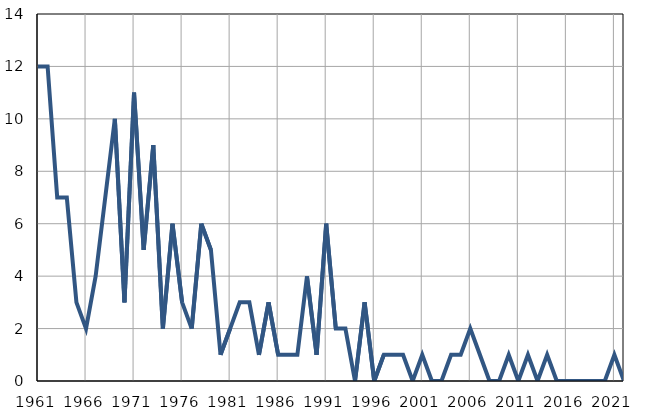
| Category | Infants
deaths |
|---|---|
| 1961.0 | 12 |
| 1962.0 | 12 |
| 1963.0 | 7 |
| 1964.0 | 7 |
| 1965.0 | 3 |
| 1966.0 | 2 |
| 1967.0 | 4 |
| 1968.0 | 7 |
| 1969.0 | 10 |
| 1970.0 | 3 |
| 1971.0 | 11 |
| 1972.0 | 5 |
| 1973.0 | 9 |
| 1974.0 | 2 |
| 1975.0 | 6 |
| 1976.0 | 3 |
| 1977.0 | 2 |
| 1978.0 | 6 |
| 1979.0 | 5 |
| 1980.0 | 1 |
| 1981.0 | 2 |
| 1982.0 | 3 |
| 1983.0 | 3 |
| 1984.0 | 1 |
| 1985.0 | 3 |
| 1986.0 | 1 |
| 1987.0 | 1 |
| 1988.0 | 1 |
| 1989.0 | 4 |
| 1990.0 | 1 |
| 1991.0 | 6 |
| 1992.0 | 2 |
| 1993.0 | 2 |
| 1994.0 | 0 |
| 1995.0 | 3 |
| 1996.0 | 0 |
| 1997.0 | 1 |
| 1998.0 | 1 |
| 1999.0 | 1 |
| 2000.0 | 0 |
| 2001.0 | 1 |
| 2002.0 | 0 |
| 2003.0 | 0 |
| 2004.0 | 1 |
| 2005.0 | 1 |
| 2006.0 | 2 |
| 2007.0 | 1 |
| 2008.0 | 0 |
| 2009.0 | 0 |
| 2010.0 | 1 |
| 2011.0 | 0 |
| 2012.0 | 1 |
| 2013.0 | 0 |
| 2014.0 | 1 |
| 2015.0 | 0 |
| 2016.0 | 0 |
| 2017.0 | 0 |
| 2018.0 | 0 |
| 2019.0 | 0 |
| 2020.0 | 0 |
| 2021.0 | 1 |
| 2022.0 | 0 |